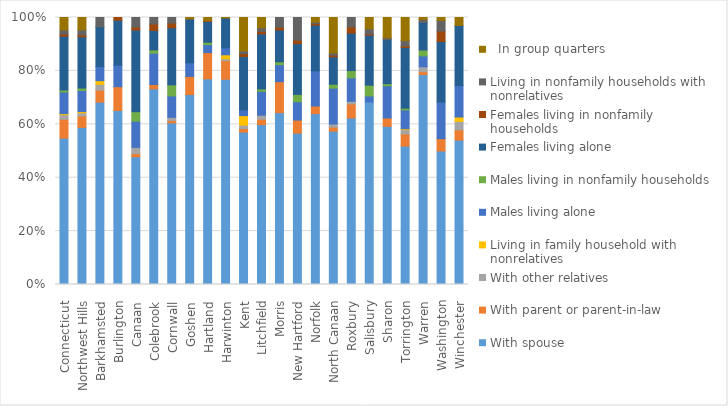
| Category | With spouse | With parent or parent-in-law | With other relatives | Living in family household with nonrelatives | Males living alone | Males living in nonfamily households | Females living alone | Females living in nonfamily households | Living in nonfamily households with nonrelatives |   In group quarters |
|---|---|---|---|---|---|---|---|---|---|---|
| Connecticut | 291023 | 37624 | 9026 | 2217 | 43001 | 4051 | 106929 | 4700 | 7750 | 24758 |
| Northwest Hills | 12211 | 886 | 244 | 100 | 1640 | 192 | 3970 | 161 | 382 | 966 |
| Barkhamsted | 349 | 23 | 11 | 7 | 27 | 0 | 76 | 0 | 18 | 0 |
| Burlington | 694 | 95 | 0 | 0 | 86 | 0 | 179 | 11 | 0 | 0 |
| Canaan | 122 | 3 | 6 | 0 | 25 | 9 | 78 | 3 | 9 | 0 |
| Colebrook | 181 | 4 | 0 | 0 | 29 | 3 | 18 | 6 | 6 | 0 |
| Cornwall | 204 | 3 | 4 | 0 | 27 | 14 | 72 | 6 | 7 | 0 |
| Goshen | 377 | 36 | 0 | 0 | 27 | 0 | 87 | 0 | 0 | 3 |
| Hartland | 258 | 33 | 0 | 0 | 10 | 3 | 26 | 1 | 0 | 4 |
| Harwinton | 798 | 72 | 7 | 16 | 27 | 0 | 116 | 0 | 0 | 2 |
| Kent | 351 | 8 | 8 | 22 | 13 | 0 | 123 | 7 | 6 | 77 |
| Litchfield | 921 | 31 | 23 | 0 | 138 | 14 | 317 | 14 | 21 | 59 |
| Morris | 233 | 42 | 0 | 0 | 23 | 4 | 43 | 4 | 13 | 0 |
| New Hartford | 602 | 52 | 0 | 0 | 73 | 29 | 202 | 14 | 90 | 0 |
| Norfolk | 224 | 10 | 0 | 0 | 46 | 0 | 60 | 2 | 2 | 6 |
| North Canaan | 432 | 11 | 9 | 0 | 101 | 11 | 77 | 5 | 6 | 100 |
| Roxbury | 320 | 27 | 5 | 0 | 45 | 14 | 72 | 12 | 18 | 0 |
| Salisbury | 628 | 0 | 0 | 0 | 21 | 37 | 172 | 5 | 17 | 39 |
| Sharon | 507 | 27 | 0 | 0 | 103 | 7 | 141 | 0 | 6 | 65 |
| Torrington | 3211 | 284 | 99 | 20 | 437 | 41 | 1407 | 36 | 125 | 536 |
| Warren | 213 | 3 | 5 | 0 | 11 | 6 | 28 | 0 | 3 | 2 |
| Washington | 444 | 41 | 0 | 0 | 122 | 0 | 201 | 35 | 35 | 10 |
| Winchester | 1142 | 81 | 67 | 35 | 249 | 0 | 475 | 0 | 0 | 63 |